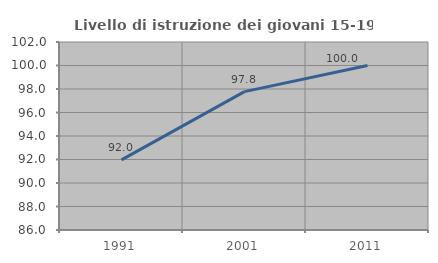
| Category | Livello di istruzione dei giovani 15-19 anni |
|---|---|
| 1991.0 | 91.964 |
| 2001.0 | 97.778 |
| 2011.0 | 100 |